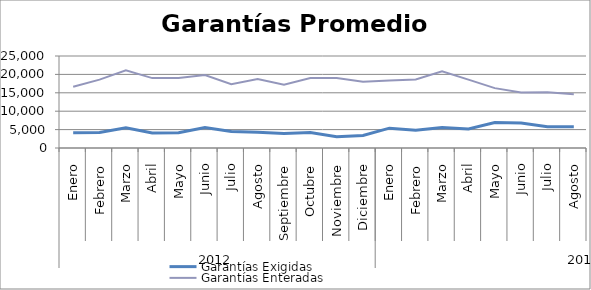
| Category | Garantías Exigidas | Garantías Enteradas |
|---|---|---|
| 0 | 4146.8 | 16662.483 |
| 1 | 4190.531 | 18572.749 |
| 2 | 5482.211 | 21128.648 |
| 3 | 4079.038 | 18997.51 |
| 4 | 4141.554 | 19005.364 |
| 5 | 5549.139 | 19818.91 |
| 6 | 4487.023 | 17351.39 |
| 7 | 4277.924 | 18719.955 |
| 8 | 3940.893 | 17217.403 |
| 9 | 4180.69 | 19046.939 |
| 10 | 3056.997 | 19028.425 |
| 11 | 3426.799 | 17994.819 |
| 12 | 5390.461 | 18317.043 |
| 13 | 4807.91 | 18608.477 |
| 14 | 5582.739 | 20850.446 |
| 15 | 5196.755 | 18583.166 |
| 16 | 6912.615 | 16266.455 |
| 17 | 6790.981 | 15108.06 |
| 18 | 5787.122 | 15161.964 |
| 19 | 5780.082 | 14588.597 |